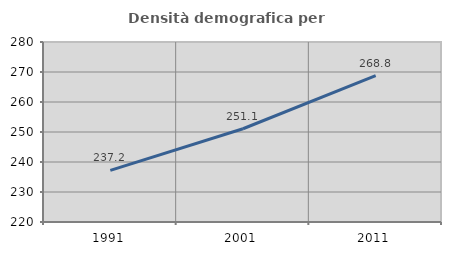
| Category | Densità demografica |
|---|---|
| 1991.0 | 237.223 |
| 2001.0 | 251.08 |
| 2011.0 | 268.785 |